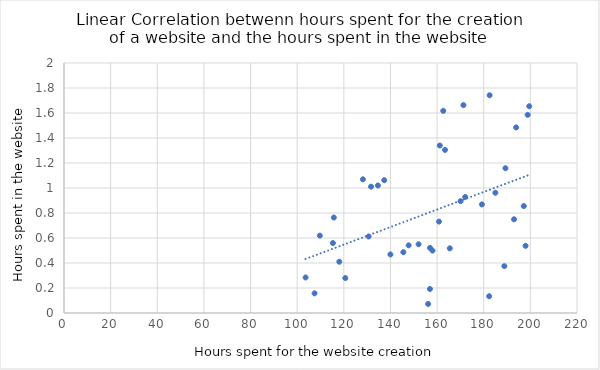
| Category | Hours spent in the website |
|---|---|
| 158.0393497087358 | 0.499 |
| 197.18368301107745 | 0.855 |
| 120.6267872032713 | 0.28 |
| 107.45706395929709 | 0.157 |
| 179.22108951652507 | 0.869 |
| 165.44176124913875 | 0.517 |
| 131.6599789267661 | 1.011 |
| 193.00194245721792 | 0.75 |
| 160.81132412327787 | 0.731 |
| 147.7991747498799 | 0.541 |
| 163.39441093398736 | 1.305 |
| 199.51393474413348 | 1.654 |
| 162.6412100919973 | 1.617 |
| 156.93959984362283 | 0.192 |
| 193.91723166223022 | 1.484 |
| 137.33521281763842 | 1.063 |
| 118.06613726047772 | 0.41 |
| 134.62302632868008 | 1.02 |
| 115.3178192520628 | 0.56 |
| 156.95848199328927 | 0.521 |
| 145.52341527178203 | 0.486 |
| 115.70938148625876 | 0.764 |
| 152.06332842624658 | 0.55 |
| 109.71762786574446 | 0.619 |
| 198.8513243328222 | 1.585 |
| 182.51898096335182 | 1.742 |
| 103.59558120203228 | 0.284 |
| 156.15448777787606 | 0.072 |
| 182.3210532741488 | 0.134 |
| 161.15973473355766 | 1.34 |
| 172.05368508572997 | 0.928 |
| 128.19146462486268 | 1.069 |
| 197.9401634892924 | 0.537 |
| 171.2924069035197 | 1.663 |
| 184.99043136940531 | 0.962 |
| 139.9827356425667 | 0.468 |
| 170.06463760161301 | 0.895 |
| 189.31363626791403 | 1.158 |
| 188.84420571332458 | 0.375 |
| 130.63267537035736 | 0.612 |